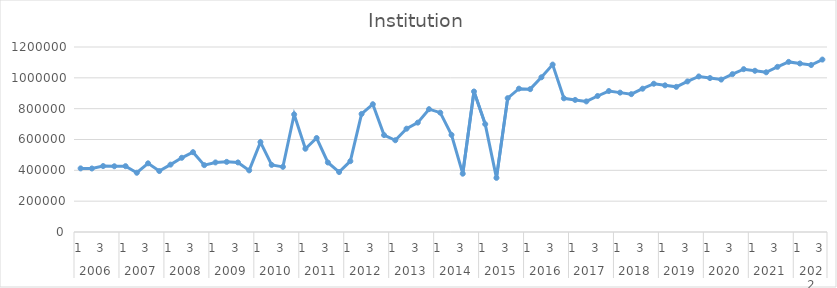
| Category | Institution |
|---|---|
| 0 | 412632 |
| 1 | 411934 |
| 2 | 427725 |
| 3 | 426417 |
| 4 | 426980 |
| 5 | 384257 |
| 6 | 445402 |
| 7 | 395387 |
| 8 | 436969 |
| 9 | 481370 |
| 10 | 517793 |
| 11 | 433644 |
| 12 | 451273 |
| 13 | 454875 |
| 14 | 451247 |
| 15 | 399568 |
| 16 | 583127 |
| 17 | 435191 |
| 18 | 422561 |
| 19 | 762731 |
| 20 | 540178 |
| 21 | 609575 |
| 22 | 450868 |
| 23 | 388873 |
| 24 | 459491 |
| 25 | 765836 |
| 26 | 828756 |
| 27 | 628558 |
| 28 | 595184 |
| 29 | 670174 |
| 30 | 709453 |
| 31 | 796729 |
| 32 | 774023 |
| 33 | 630110 |
| 34 | 378181 |
| 35 | 911393 |
| 36 | 699658 |
| 37 | 351109 |
| 38 | 868177 |
| 39 | 929756 |
| 40 | 926567 |
| 41 | 1003575 |
| 42 | 1085893 |
| 43 | 867170.093 |
| 44 | 856768.72 |
| 45 | 846943.629 |
| 46 | 882220.902 |
| 47 | 914418.183 |
| 48 | 904016.81 |
| 49 | 894191.719 |
| 50 | 929468.992 |
| 51 | 961666.273 |
| 52 | 951264.899 |
| 53 | 941439.808 |
| 54 | 976717.081 |
| 55 | 1008914.362 |
| 56 | 998512.989 |
| 57 | 988687.898 |
| 58 | 1023965.171 |
| 59 | 1056162.452 |
| 60 | 1045761.079 |
| 61 | 1035935.988 |
| 62 | 1071213.261 |
| 63 | 1103410.542 |
| 64 | 1093009.168 |
| 65 | 1083184.078 |
| 66 | 1118461.35 |